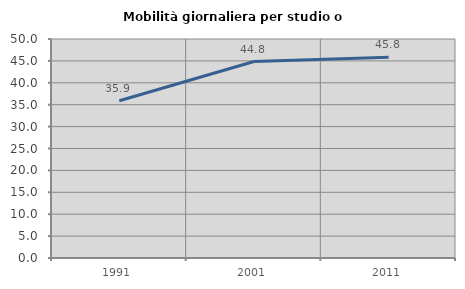
| Category | Mobilità giornaliera per studio o lavoro |
|---|---|
| 1991.0 | 35.905 |
| 2001.0 | 44.85 |
| 2011.0 | 45.839 |